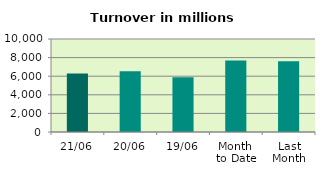
| Category | Series 0 |
|---|---|
| 21/06 | 6295.404 |
| 20/06 | 6526.688 |
| 19/06 | 5887.946 |
| Month 
to Date | 7682.282 |
| Last
Month | 7604.877 |